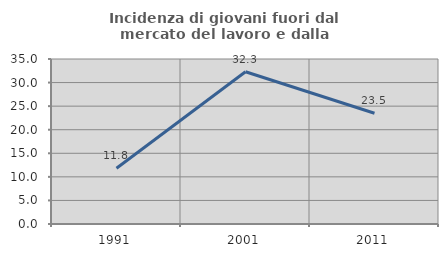
| Category | Incidenza di giovani fuori dal mercato del lavoro e dalla formazione  |
|---|---|
| 1991.0 | 11.837 |
| 2001.0 | 32.3 |
| 2011.0 | 23.49 |